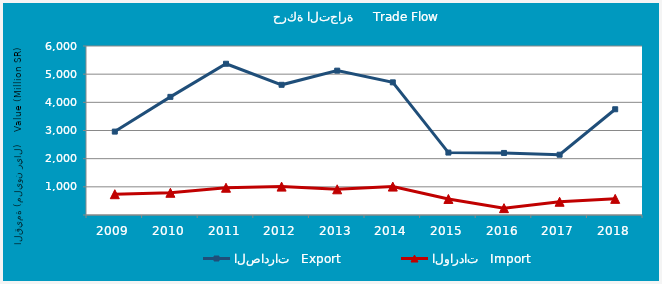
| Category | الصادرات   Export | الواردات   Import |
|---|---|---|
| 2009.0 | 2960880568 | 737981774 |
| 2010.0 | 4194226815 | 788475936 |
| 2011.0 | 5369497267 | 968536992 |
| 2012.0 | 4622216668 | 1007610016 |
| 2013.0 | 5125121288 | 912114778 |
| 2014.0 | 4709557708 | 1008907776 |
| 2015.0 | 2216473239 | 569829392 |
| 2016.0 | 2203211614 | 243143842 |
| 2017.0 | 2139967153 | 470342937 |
| 2018.0 | 3753969058 | 572768182 |